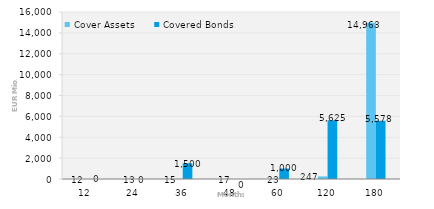
| Category | Cover Assets | Covered Bonds |
|---|---|---|
| 12.0 | 12.426 | 0 |
| 24.0 | 13.26 | 0 |
| 36.0 | 14.61 | 1500 |
| 48.0 | 17.062 | 0 |
| 60.0 | 22.546 | 1000 |
| 120.0 | 247.293 | 5625 |
| 180.0 | 14962.802 | 5578 |